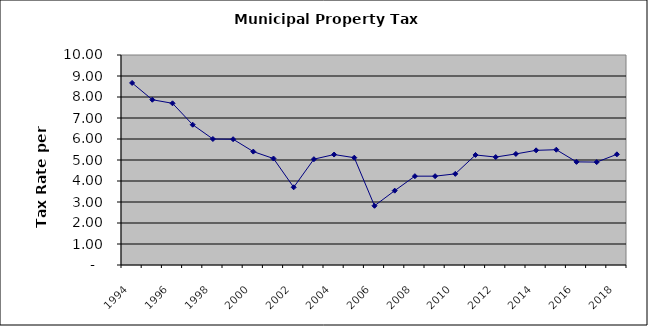
| Category | Rate |
|---|---|
| 1994.0 | 8.67 |
| 1995.0 | 7.87 |
| 1996.0 | 7.7 |
| 1997.0 | 6.68 |
| 1998.0 | 6 |
| 1999.0 | 5.99 |
| 2000.0 | 5.4 |
| 2001.0 | 5.07 |
| 2002.0 | 3.7 |
| 2003.0 | 5.04 |
| 2004.0 | 5.26 |
| 2005.0 | 5.11 |
| 2006.0 | 2.82 |
| 2007.0 | 3.54 |
| 2008.0 | 4.23 |
| 2009.0 | 4.23 |
| 2010.0 | 4.34 |
| 2011.0 | 5.24 |
| 2012.0 | 5.14 |
| 2013.0 | 5.29 |
| 2014.0 | 5.46 |
| 2015.0 | 5.49 |
| 2016.0 | 4.91 |
| 2017.0 | 4.9 |
| 2018.0 | 5.27 |